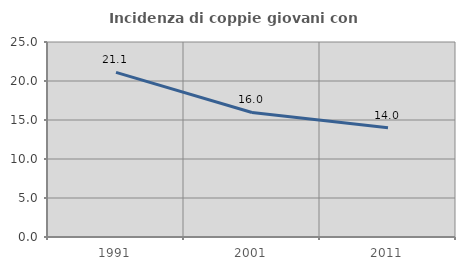
| Category | Incidenza di coppie giovani con figli |
|---|---|
| 1991.0 | 21.107 |
| 2001.0 | 15.964 |
| 2011.0 | 14 |